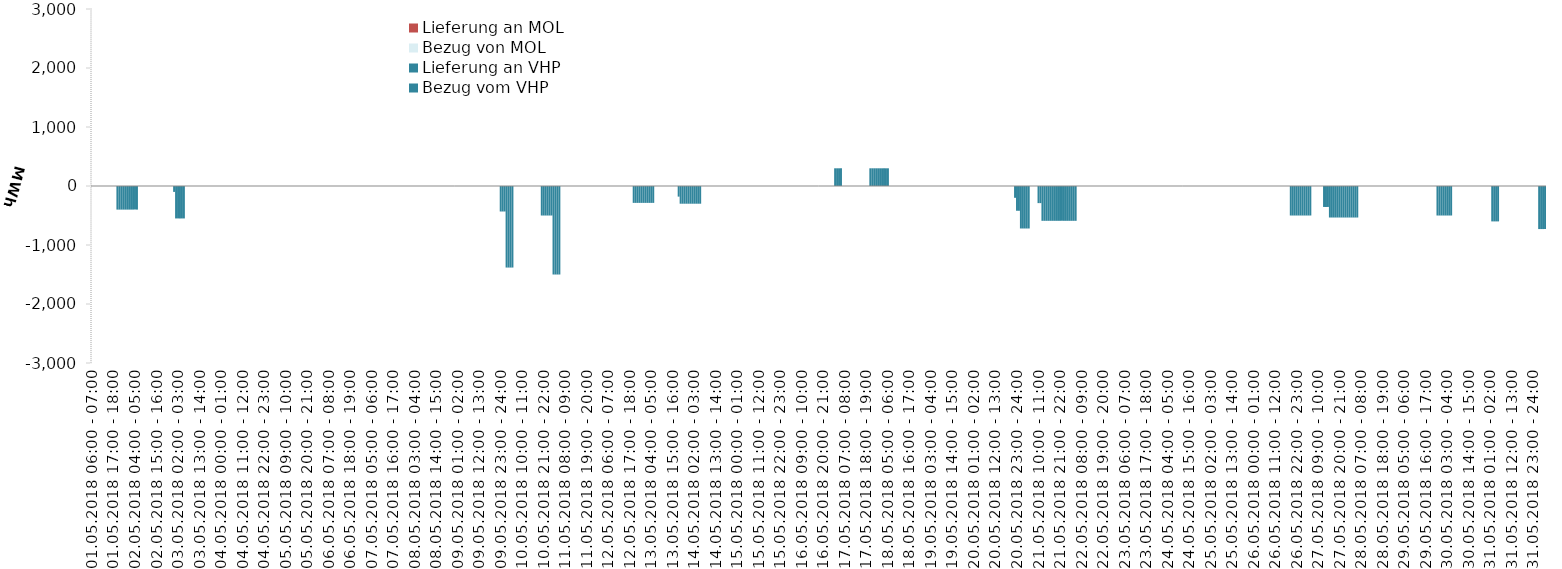
| Category | Bezug vom VHP | Lieferung an VHP | Bezug von MOL | Lieferung an MOL |
|---|---|---|---|---|
| 01.05.2018 06:00 - 07:00 | 0 | 0 | 0 | 0 |
| 01.05.2018 07:00 - 08:00 | 0 | 0 | 0 | 0 |
| 01.05.2018 08:00 - 09:00 | 0 | 0 | 0 | 0 |
| 01.05.2018 09:00 - 10:00 | 0 | 0 | 0 | 0 |
| 01.05.2018 10:00 - 11:00 | 0 | 0 | 0 | 0 |
| 01.05.2018 11:00 - 12:00 | 0 | 0 | 0 | 0 |
| 01.05.2018 12:00 - 13:00 | 0 | 0 | 0 | 0 |
| 01.05.2018 13:00 - 14:00 | 0 | 0 | 0 | 0 |
| 01.05.2018 14:00 - 15:00 | 0 | 0 | 0 | 0 |
| 01.05.2018 15:00 - 16:00 | 0 | 0 | 0 | 0 |
| 01.05.2018 16:00 - 17:00 | 0 | 0 | 0 | 0 |
| 01.05.2018 17:00 - 18:00 | 0 | 0 | 0 | 0 |
| 01.05.2018 18:00 - 19:00 | 0 | 0 | 0 | 0 |
| 01.05.2018 19:00 - 20:00 | 0 | -400 | 0 | 0 |
| 01.05.2018 20:00 - 21:00 | 0 | -400 | 0 | 0 |
| 01.05.2018 21:00 - 22:00 | 0 | -400 | 0 | 0 |
| 01.05.2018 22:00 - 23:00 | 0 | -400 | 0 | 0 |
| 01.05.2018 23:00 - 24:00 | 0 | -400 | 0 | 0 |
| 02.05.2018 00:00 - 01:00 | 0 | -400 | 0 | 0 |
| 02.05.2018 01:00 - 02:00 | 0 | -400 | 0 | 0 |
| 02.05.2018 02:00 - 03:00 | 0 | -400 | 0 | 0 |
| 02.05.2018 03:00 - 04:00 | 0 | -400 | 0 | 0 |
| 02.05.2018 04:00 - 05:00 | 0 | -400 | 0 | 0 |
| 02.05.2018 05:00 - 06:00 | 0 | -400 | 0 | 0 |
| 02.05.2018 06:00 - 07:00 | 0 | 0 | 0 | 0 |
| 02.05.2018 07:00 - 08:00 | 0 | 0 | 0 | 0 |
| 02.05.2018 08:00 - 09:00 | 0 | 0 | 0 | 0 |
| 02.05.2018 09:00 - 10:00 | 0 | 0 | 0 | 0 |
| 02.05.2018 10:00 - 11:00 | 0 | 0 | 0 | 0 |
| 02.05.2018 11:00 - 12:00 | 0 | 0 | 0 | 0 |
| 02.05.2018 12:00 - 13:00 | 0 | 0 | 0 | 0 |
| 02.05.2018 13:00 - 14:00 | 0 | 0 | 0 | 0 |
| 02.05.2018 14:00 - 15:00 | 0 | 0 | 0 | 0 |
| 02.05.2018 15:00 - 16:00 | 0 | 0 | 0 | 0 |
| 02.05.2018 16:00 - 17:00 | 0 | 0 | 0 | 0 |
| 02.05.2018 17:00 - 18:00 | 0 | 0 | 0 | 0 |
| 02.05.2018 18:00 - 19:00 | 0 | 0 | 0 | 0 |
| 02.05.2018 19:00 - 20:00 | 0 | 0 | 0 | 0 |
| 02.05.2018 20:00 - 21:00 | 0 | 0 | 0 | 0 |
| 02.05.2018 21:00 - 22:00 | 0 | 0 | 0 | 0 |
| 02.05.2018 22:00 - 23:00 | 0 | 0 | 0 | 0 |
| 02.05.2018 23:00 - 24:00 | 0 | 0 | 0 | 0 |
| 03.05.2018 00:00 - 01:00 | 0 | -100 | 0 | 0 |
| 03.05.2018 01:00 - 02:00 | 0 | -550 | 0 | 0 |
| 03.05.2018 02:00 - 03:00 | 0 | -550 | 0 | 0 |
| 03.05.2018 03:00 - 04:00 | 0 | -550 | 0 | 0 |
| 03.05.2018 04:00 - 05:00 | 0 | -550 | 0 | 0 |
| 03.05.2018 05:00 - 06:00 | 0 | -550 | 0 | 0 |
| 03.05.2018 06:00 - 07:00 | 0 | 0 | 0 | 0 |
| 03.05.2018 07:00 - 08:00 | 0 | 0 | 0 | 0 |
| 03.05.2018 08:00 - 09:00 | 0 | 0 | 0 | 0 |
| 03.05.2018 09:00 - 10:00 | 0 | 0 | 0 | 0 |
| 03.05.2018 10:00 - 11:00 | 0 | 0 | 0 | 0 |
| 03.05.2018 11:00 - 12:00 | 0 | 0 | 0 | 0 |
| 03.05.2018 12:00 - 13:00 | 0 | 0 | 0 | 0 |
| 03.05.2018 13:00 - 14:00 | 0 | 0 | 0 | 0 |
| 03.05.2018 14:00 - 15:00 | 0 | 0 | 0 | 0 |
| 03.05.2018 15:00 - 16:00 | 0 | 0 | 0 | 0 |
| 03.05.2018 16:00 - 17:00 | 0 | 0 | 0 | 0 |
| 03.05.2018 17:00 - 18:00 | 0 | 0 | 0 | 0 |
| 03.05.2018 18:00 - 19:00 | 0 | 0 | 0 | 0 |
| 03.05.2018 19:00 - 20:00 | 0 | 0 | 0 | 0 |
| 03.05.2018 20:00 - 21:00 | 0 | 0 | 0 | 0 |
| 03.05.2018 21:00 - 22:00 | 0 | 0 | 0 | 0 |
| 03.05.2018 22:00 - 23:00 | 0 | 0 | 0 | 0 |
| 03.05.2018 23:00 - 24:00 | 0 | 0 | 0 | 0 |
| 04.05.2018 00:00 - 01:00 | 0 | 0 | 0 | 0 |
| 04.05.2018 01:00 - 02:00 | 0 | 0 | 0 | 0 |
| 04.05.2018 02:00 - 03:00 | 0 | 0 | 0 | 0 |
| 04.05.2018 03:00 - 04:00 | 0 | 0 | 0 | 0 |
| 04.05.2018 04:00 - 05:00 | 0 | 0 | 0 | 0 |
| 04.05.2018 05:00 - 06:00 | 0 | 0 | 0 | 0 |
| 04.05.2018 06:00 - 07:00 | 0 | 0 | 0 | 0 |
| 04.05.2018 07:00 - 08:00 | 0 | 0 | 0 | 0 |
| 04.05.2018 08:00 - 09:00 | 0 | 0 | 0 | 0 |
| 04.05.2018 09:00 - 10:00 | 0 | 0 | 0 | 0 |
| 04.05.2018 10:00 - 11:00 | 0 | 0 | 0 | 0 |
| 04.05.2018 11:00 - 12:00 | 0 | 0 | 0 | 0 |
| 04.05.2018 12:00 - 13:00 | 0 | 0 | 0 | 0 |
| 04.05.2018 13:00 - 14:00 | 0 | 0 | 0 | 0 |
| 04.05.2018 14:00 - 15:00 | 0 | 0 | 0 | 0 |
| 04.05.2018 15:00 - 16:00 | 0 | 0 | 0 | 0 |
| 04.05.2018 16:00 - 17:00 | 0 | 0 | 0 | 0 |
| 04.05.2018 17:00 - 18:00 | 0 | 0 | 0 | 0 |
| 04.05.2018 18:00 - 19:00 | 0 | 0 | 0 | 0 |
| 04.05.2018 19:00 - 20:00 | 0 | 0 | 0 | 0 |
| 04.05.2018 20:00 - 21:00 | 0 | 0 | 0 | 0 |
| 04.05.2018 21:00 - 22:00 | 0 | 0 | 0 | 0 |
| 04.05.2018 22:00 - 23:00 | 0 | 0 | 0 | 0 |
| 04.05.2018 23:00 - 24:00 | 0 | 0 | 0 | 0 |
| 05.05.2018 00:00 - 01:00 | 0 | 0 | 0 | 0 |
| 05.05.2018 01:00 - 02:00 | 0 | 0 | 0 | 0 |
| 05.05.2018 02:00 - 03:00 | 0 | 0 | 0 | 0 |
| 05.05.2018 03:00 - 04:00 | 0 | 0 | 0 | 0 |
| 05.05.2018 04:00 - 05:00 | 0 | 0 | 0 | 0 |
| 05.05.2018 05:00 - 06:00 | 0 | 0 | 0 | 0 |
| 05.05.2018 06:00 - 07:00 | 0 | 0 | 0 | 0 |
| 05.05.2018 07:00 - 08:00 | 0 | 0 | 0 | 0 |
| 05.05.2018 08:00 - 09:00 | 0 | 0 | 0 | 0 |
| 05.05.2018 09:00 - 10:00 | 0 | 0 | 0 | 0 |
| 05.05.2018 10:00 - 11:00 | 0 | 0 | 0 | 0 |
| 05.05.2018 11:00 - 12:00 | 0 | 0 | 0 | 0 |
| 05.05.2018 12:00 - 13:00 | 0 | 0 | 0 | 0 |
| 05.05.2018 13:00 - 14:00 | 0 | 0 | 0 | 0 |
| 05.05.2018 14:00 - 15:00 | 0 | 0 | 0 | 0 |
| 05.05.2018 15:00 - 16:00 | 0 | 0 | 0 | 0 |
| 05.05.2018 16:00 - 17:00 | 0 | 0 | 0 | 0 |
| 05.05.2018 17:00 - 18:00 | 0 | 0 | 0 | 0 |
| 05.05.2018 18:00 - 19:00 | 0 | 0 | 0 | 0 |
| 05.05.2018 19:00 - 20:00 | 0 | 0 | 0 | 0 |
| 05.05.2018 20:00 - 21:00 | 0 | 0 | 0 | 0 |
| 05.05.2018 21:00 - 22:00 | 0 | 0 | 0 | 0 |
| 05.05.2018 22:00 - 23:00 | 0 | 0 | 0 | 0 |
| 05.05.2018 23:00 - 24:00 | 0 | 0 | 0 | 0 |
| 06.05.2018 00:00 - 01:00 | 0 | 0 | 0 | 0 |
| 06.05.2018 01:00 - 02:00 | 0 | 0 | 0 | 0 |
| 06.05.2018 02:00 - 03:00 | 0 | 0 | 0 | 0 |
| 06.05.2018 03:00 - 04:00 | 0 | 0 | 0 | 0 |
| 06.05.2018 04:00 - 05:00 | 0 | 0 | 0 | 0 |
| 06.05.2018 05:00 - 06:00 | 0 | 0 | 0 | 0 |
| 06.05.2018 06:00 - 07:00 | 0 | 0 | 0 | 0 |
| 06.05.2018 07:00 - 08:00 | 0 | 0 | 0 | 0 |
| 06.05.2018 08:00 - 09:00 | 0 | 0 | 0 | 0 |
| 06.05.2018 09:00 - 10:00 | 0 | 0 | 0 | 0 |
| 06.05.2018 10:00 - 11:00 | 0 | 0 | 0 | 0 |
| 06.05.2018 11:00 - 12:00 | 0 | 0 | 0 | 0 |
| 06.05.2018 12:00 - 13:00 | 0 | 0 | 0 | 0 |
| 06.05.2018 13:00 - 14:00 | 0 | 0 | 0 | 0 |
| 06.05.2018 14:00 - 15:00 | 0 | 0 | 0 | 0 |
| 06.05.2018 15:00 - 16:00 | 0 | 0 | 0 | 0 |
| 06.05.2018 16:00 - 17:00 | 0 | 0 | 0 | 0 |
| 06.05.2018 17:00 - 18:00 | 0 | 0 | 0 | 0 |
| 06.05.2018 18:00 - 19:00 | 0 | 0 | 0 | 0 |
| 06.05.2018 19:00 - 20:00 | 0 | 0 | 0 | 0 |
| 06.05.2018 20:00 - 21:00 | 0 | 0 | 0 | 0 |
| 06.05.2018 21:00 - 22:00 | 0 | 0 | 0 | 0 |
| 06.05.2018 22:00 - 23:00 | 0 | 0 | 0 | 0 |
| 06.05.2018 23:00 - 24:00 | 0 | 0 | 0 | 0 |
| 07.05.2018 00:00 - 01:00 | 0 | 0 | 0 | 0 |
| 07.05.2018 01:00 - 02:00 | 0 | 0 | 0 | 0 |
| 07.05.2018 02:00 - 03:00 | 0 | 0 | 0 | 0 |
| 07.05.2018 03:00 - 04:00 | 0 | 0 | 0 | 0 |
| 07.05.2018 04:00 - 05:00 | 0 | 0 | 0 | 0 |
| 07.05.2018 05:00 - 06:00 | 0 | 0 | 0 | 0 |
| 07.05.2018 06:00 - 07:00 | 0 | 0 | 0 | 0 |
| 07.05.2018 07:00 - 08:00 | 0 | 0 | 0 | 0 |
| 07.05.2018 08:00 - 09:00 | 0 | 0 | 0 | 0 |
| 07.05.2018 09:00 - 10:00 | 0 | 0 | 0 | 0 |
| 07.05.2018 10:00 - 11:00 | 0 | 0 | 0 | 0 |
| 07.05.2018 11:00 - 12:00 | 0 | 0 | 0 | 0 |
| 07.05.2018 12:00 - 13:00 | 0 | 0 | 0 | 0 |
| 07.05.2018 13:00 - 14:00 | 0 | 0 | 0 | 0 |
| 07.05.2018 14:00 - 15:00 | 0 | 0 | 0 | 0 |
| 07.05.2018 15:00 - 16:00 | 0 | 0 | 0 | 0 |
| 07.05.2018 16:00 - 17:00 | 0 | 0 | 0 | 0 |
| 07.05.2018 17:00 - 18:00 | 0 | 0 | 0 | 0 |
| 07.05.2018 18:00 - 19:00 | 0 | 0 | 0 | 0 |
| 07.05.2018 19:00 - 20:00 | 0 | 0 | 0 | 0 |
| 07.05.2018 20:00 - 21:00 | 0 | 0 | 0 | 0 |
| 07.05.2018 21:00 - 22:00 | 0 | 0 | 0 | 0 |
| 07.05.2018 22:00 - 23:00 | 0 | 0 | 0 | 0 |
| 07.05.2018 23:00 - 24:00 | 0 | 0 | 0 | 0 |
| 08.05.2018 00:00 - 01:00 | 0 | 0 | 0 | 0 |
| 08.05.2018 01:00 - 02:00 | 0 | 0 | 0 | 0 |
| 08.05.2018 02:00 - 03:00 | 0 | 0 | 0 | 0 |
| 08.05.2018 03:00 - 04:00 | 0 | 0 | 0 | 0 |
| 08.05.2018 04:00 - 05:00 | 0 | 0 | 0 | 0 |
| 08.05.2018 05:00 - 06:00 | 0 | 0 | 0 | 0 |
| 08.05.2018 06:00 - 07:00 | 0 | 0 | 0 | 0 |
| 08.05.2018 07:00 - 08:00 | 0 | 0 | 0 | 0 |
| 08.05.2018 08:00 - 09:00 | 0 | 0 | 0 | 0 |
| 08.05.2018 09:00 - 10:00 | 0 | 0 | 0 | 0 |
| 08.05.2018 10:00 - 11:00 | 0 | 0 | 0 | 0 |
| 08.05.2018 11:00 - 12:00 | 0 | 0 | 0 | 0 |
| 08.05.2018 12:00 - 13:00 | 0 | 0 | 0 | 0 |
| 08.05.2018 13:00 - 14:00 | 0 | 0 | 0 | 0 |
| 08.05.2018 14:00 - 15:00 | 0 | 0 | 0 | 0 |
| 08.05.2018 15:00 - 16:00 | 0 | 0 | 0 | 0 |
| 08.05.2018 16:00 - 17:00 | 0 | 0 | 0 | 0 |
| 08.05.2018 17:00 - 18:00 | 0 | 0 | 0 | 0 |
| 08.05.2018 18:00 - 19:00 | 0 | 0 | 0 | 0 |
| 08.05.2018 19:00 - 20:00 | 0 | 0 | 0 | 0 |
| 08.05.2018 20:00 - 21:00 | 0 | 0 | 0 | 0 |
| 08.05.2018 21:00 - 22:00 | 0 | 0 | 0 | 0 |
| 08.05.2018 22:00 - 23:00 | 0 | 0 | 0 | 0 |
| 08.05.2018 23:00 - 24:00 | 0 | 0 | 0 | 0 |
| 09.05.2018 00:00 - 01:00 | 0 | 0 | 0 | 0 |
| 09.05.2018 01:00 - 02:00 | 0 | 0 | 0 | 0 |
| 09.05.2018 02:00 - 03:00 | 0 | 0 | 0 | 0 |
| 09.05.2018 03:00 - 04:00 | 0 | 0 | 0 | 0 |
| 09.05.2018 04:00 - 05:00 | 0 | 0 | 0 | 0 |
| 09.05.2018 05:00 - 06:00 | 0 | 0 | 0 | 0 |
| 09.05.2018 06:00 - 07:00 | 0 | 0 | 0 | 0 |
| 09.05.2018 07:00 - 08:00 | 0 | 0 | 0 | 0 |
| 09.05.2018 08:00 - 09:00 | 0 | 0 | 0 | 0 |
| 09.05.2018 09:00 - 10:00 | 0 | 0 | 0 | 0 |
| 09.05.2018 10:00 - 11:00 | 0 | 0 | 0 | 0 |
| 09.05.2018 11:00 - 12:00 | 0 | 0 | 0 | 0 |
| 09.05.2018 12:00 - 13:00 | 0 | 0 | 0 | 0 |
| 09.05.2018 13:00 - 14:00 | 0 | 0 | 0 | 0 |
| 09.05.2018 14:00 - 15:00 | 0 | 0 | 0 | 0 |
| 09.05.2018 15:00 - 16:00 | 0 | 0 | 0 | 0 |
| 09.05.2018 16:00 - 17:00 | 0 | 0 | 0 | 0 |
| 09.05.2018 17:00 - 18:00 | 0 | 0 | 0 | 0 |
| 09.05.2018 18:00 - 19:00 | 0 | 0 | 0 | 0 |
| 09.05.2018 19:00 - 20:00 | 0 | 0 | 0 | 0 |
| 09.05.2018 20:00 - 21:00 | 0 | 0 | 0 | 0 |
| 09.05.2018 21:00 - 22:00 | 0 | 0 | 0 | 0 |
| 09.05.2018 22:00 - 23:00 | 0 | 0 | 0 | 0 |
| 09.05.2018 23:00 - 24:00 | 0 | -432 | 0 | 0 |
| 10.05.2018 00:00 - 01:00 | 0 | -432 | 0 | 0 |
| 10.05.2018 01:00 - 02:00 | 0 | -432 | 0 | 0 |
| 10.05.2018 02:00 - 03:00 | 0 | -1382 | 0 | 0 |
| 10.05.2018 03:00 - 04:00 | 0 | -1382 | 0 | 0 |
| 10.05.2018 04:00 - 05:00 | 0 | -1382 | 0 | 0 |
| 10.05.2018 05:00 - 06:00 | 0 | -1382 | 0 | 0 |
| 10.05.2018 06:00 - 07:00 | 0 | 0 | 0 | 0 |
| 10.05.2018 07:00 - 08:00 | 0 | 0 | 0 | 0 |
| 10.05.2018 08:00 - 09:00 | 0 | 0 | 0 | 0 |
| 10.05.2018 09:00 - 10:00 | 0 | 0 | 0 | 0 |
| 10.05.2018 10:00 - 11:00 | 0 | 0 | 0 | 0 |
| 10.05.2018 11:00 - 12:00 | 0 | 0 | 0 | 0 |
| 10.05.2018 12:00 - 13:00 | 0 | 0 | 0 | 0 |
| 10.05.2018 13:00 - 14:00 | 0 | 0 | 0 | 0 |
| 10.05.2018 14:00 - 15:00 | 0 | 0 | 0 | 0 |
| 10.05.2018 15:00 - 16:00 | 0 | 0 | 0 | 0 |
| 10.05.2018 16:00 - 17:00 | 0 | 0 | 0 | 0 |
| 10.05.2018 17:00 - 18:00 | 0 | 0 | 0 | 0 |
| 10.05.2018 18:00 - 19:00 | 0 | 0 | 0 | 0 |
| 10.05.2018 19:00 - 20:00 | 0 | 0 | 0 | 0 |
| 10.05.2018 20:00 - 21:00 | 0 | -500 | 0 | 0 |
| 10.05.2018 21:00 - 22:00 | 0 | -500 | 0 | 0 |
| 10.05.2018 22:00 - 23:00 | 0 | -500 | 0 | 0 |
| 10.05.2018 23:00 - 24:00 | 0 | -500 | 0 | 0 |
| 11.05.2018 00:00 - 01:00 | 0 | -500 | 0 | 0 |
| 11.05.2018 01:00 - 02:00 | 0 | -500 | 0 | 0 |
| 11.05.2018 02:00 - 03:00 | 0 | -1500 | 0 | 0 |
| 11.05.2018 03:00 - 04:00 | 0 | -1500 | 0 | 0 |
| 11.05.2018 04:00 - 05:00 | 0 | -1500 | 0 | 0 |
| 11.05.2018 05:00 - 06:00 | 0 | -1500 | 0 | 0 |
| 11.05.2018 06:00 - 07:00 | 0 | 0 | 0 | 0 |
| 11.05.2018 07:00 - 08:00 | 0 | 0 | 0 | 0 |
| 11.05.2018 08:00 - 09:00 | 0 | 0 | 0 | 0 |
| 11.05.2018 09:00 - 10:00 | 0 | 0 | 0 | 0 |
| 11.05.2018 10:00 - 11:00 | 0 | 0 | 0 | 0 |
| 11.05.2018 11:00 - 12:00 | 0 | 0 | 0 | 0 |
| 11.05.2018 12:00 - 13:00 | 0 | 0 | 0 | 0 |
| 11.05.2018 13:00 - 14:00 | 0 | 0 | 0 | 0 |
| 11.05.2018 14:00 - 15:00 | 0 | 0 | 0 | 0 |
| 11.05.2018 15:00 - 16:00 | 0 | 0 | 0 | 0 |
| 11.05.2018 16:00 - 17:00 | 0 | 0 | 0 | 0 |
| 11.05.2018 17:00 - 18:00 | 0 | 0 | 0 | 0 |
| 11.05.2018 18:00 - 19:00 | 0 | 0 | 0 | 0 |
| 11.05.2018 19:00 - 20:00 | 0 | 0 | 0 | 0 |
| 11.05.2018 20:00 - 21:00 | 0 | 0 | 0 | 0 |
| 11.05.2018 21:00 - 22:00 | 0 | 0 | 0 | 0 |
| 11.05.2018 22:00 - 23:00 | 0 | 0 | 0 | 0 |
| 11.05.2018 23:00 - 24:00 | 0 | 0 | 0 | 0 |
| 12.05.2018 00:00 - 01:00 | 0 | 0 | 0 | 0 |
| 12.05.2018 01:00 - 02:00 | 0 | 0 | 0 | 0 |
| 12.05.2018 02:00 - 03:00 | 0 | 0 | 0 | 0 |
| 12.05.2018 03:00 - 04:00 | 0 | 0 | 0 | 0 |
| 12.05.2018 04:00 - 05:00 | 0 | 0 | 0 | 0 |
| 12.05.2018 05:00 - 06:00 | 0 | 0 | 0 | 0 |
| 12.05.2018 06:00 - 07:00 | 0 | 0 | 0 | 0 |
| 12.05.2018 07:00 - 08:00 | 0 | 0 | 0 | 0 |
| 12.05.2018 08:00 - 09:00 | 0 | 0 | 0 | 0 |
| 12.05.2018 09:00 - 10:00 | 0 | 0 | 0 | 0 |
| 12.05.2018 10:00 - 11:00 | 0 | 0 | 0 | 0 |
| 12.05.2018 11:00 - 12:00 | 0 | 0 | 0 | 0 |
| 12.05.2018 12:00 - 13:00 | 0 | 0 | 0 | 0 |
| 12.05.2018 13:00 - 14:00 | 0 | 0 | 0 | 0 |
| 12.05.2018 14:00 - 15:00 | 0 | 0 | 0 | 0 |
| 12.05.2018 15:00 - 16:00 | 0 | 0 | 0 | 0 |
| 12.05.2018 16:00 - 17:00 | 0 | 0 | 0 | 0 |
| 12.05.2018 17:00 - 18:00 | 0 | 0 | 0 | 0 |
| 12.05.2018 18:00 - 19:00 | 0 | 0 | 0 | 0 |
| 12.05.2018 19:00 - 20:00 | 0 | -286 | 0 | 0 |
| 12.05.2018 20:00 - 21:00 | 0 | -286 | 0 | 0 |
| 12.05.2018 21:00 - 22:00 | 0 | -286 | 0 | 0 |
| 12.05.2018 22:00 - 23:00 | 0 | -286 | 0 | 0 |
| 12.05.2018 23:00 - 24:00 | 0 | -286 | 0 | 0 |
| 13.05.2018 00:00 - 01:00 | 0 | -286 | 0 | 0 |
| 13.05.2018 01:00 - 02:00 | 0 | -286 | 0 | 0 |
| 13.05.2018 02:00 - 03:00 | 0 | -286 | 0 | 0 |
| 13.05.2018 03:00 - 04:00 | 0 | -286 | 0 | 0 |
| 13.05.2018 04:00 - 05:00 | 0 | -286 | 0 | 0 |
| 13.05.2018 05:00 - 06:00 | 0 | -286 | 0 | 0 |
| 13.05.2018 06:00 - 07:00 | 0 | 0 | 0 | 0 |
| 13.05.2018 07:00 - 08:00 | 0 | 0 | 0 | 0 |
| 13.05.2018 08:00 - 09:00 | 0 | 0 | 0 | 0 |
| 13.05.2018 09:00 - 10:00 | 0 | 0 | 0 | 0 |
| 13.05.2018 10:00 - 11:00 | 0 | 0 | 0 | 0 |
| 13.05.2018 11:00 - 12:00 | 0 | 0 | 0 | 0 |
| 13.05.2018 12:00 - 13:00 | 0 | 0 | 0 | 0 |
| 13.05.2018 13:00 - 14:00 | 0 | 0 | 0 | 0 |
| 13.05.2018 14:00 - 15:00 | 0 | 0 | 0 | 0 |
| 13.05.2018 15:00 - 16:00 | 0 | 0 | 0 | 0 |
| 13.05.2018 16:00 - 17:00 | 0 | 0 | 0 | 0 |
| 13.05.2018 17:00 - 18:00 | 0 | 0 | 0 | 0 |
| 13.05.2018 18:00 - 19:00 | 0 | -180 | 0 | 0 |
| 13.05.2018 19:00 - 20:00 | 0 | -300 | 0 | 0 |
| 13.05.2018 20:00 - 21:00 | 0 | -300 | 0 | 0 |
| 13.05.2018 21:00 - 22:00 | 0 | -300 | 0 | 0 |
| 13.05.2018 22:00 - 23:00 | 0 | -300 | 0 | 0 |
| 13.05.2018 23:00 - 24:00 | 0 | -300 | 0 | 0 |
| 14.05.2018 00:00 - 01:00 | 0 | -300 | 0 | 0 |
| 14.05.2018 01:00 - 02:00 | 0 | -300 | 0 | 0 |
| 14.05.2018 02:00 - 03:00 | 0 | -300 | 0 | 0 |
| 14.05.2018 03:00 - 04:00 | 0 | -300 | 0 | 0 |
| 14.05.2018 04:00 - 05:00 | 0 | -300 | 0 | 0 |
| 14.05.2018 05:00 - 06:00 | 0 | -300 | 0 | 0 |
| 14.05.2018 06:00 - 07:00 | 0 | 0 | 0 | 0 |
| 14.05.2018 07:00 - 08:00 | 0 | 0 | 0 | 0 |
| 14.05.2018 08:00 - 09:00 | 0 | 0 | 0 | 0 |
| 14.05.2018 09:00 - 10:00 | 0 | 0 | 0 | 0 |
| 14.05.2018 10:00 - 11:00 | 0 | 0 | 0 | 0 |
| 14.05.2018 11:00 - 12:00 | 0 | 0 | 0 | 0 |
| 14.05.2018 12:00 - 13:00 | 0 | 0 | 0 | 0 |
| 14.05.2018 13:00 - 14:00 | 0 | 0 | 0 | 0 |
| 14.05.2018 14:00 - 15:00 | 0 | 0 | 0 | 0 |
| 14.05.2018 15:00 - 16:00 | 0 | 0 | 0 | 0 |
| 14.05.2018 16:00 - 17:00 | 0 | 0 | 0 | 0 |
| 14.05.2018 17:00 - 18:00 | 0 | 0 | 0 | 0 |
| 14.05.2018 18:00 - 19:00 | 0 | 0 | 0 | 0 |
| 14.05.2018 19:00 - 20:00 | 0 | 0 | 0 | 0 |
| 14.05.2018 20:00 - 21:00 | 0 | 0 | 0 | 0 |
| 14.05.2018 21:00 - 22:00 | 0 | 0 | 0 | 0 |
| 14.05.2018 22:00 - 23:00 | 0 | 0 | 0 | 0 |
| 14.05.2018 23:00 - 24:00 | 0 | 0 | 0 | 0 |
| 15.05.2018 00:00 - 01:00 | 0 | 0 | 0 | 0 |
| 15.05.2018 01:00 - 02:00 | 0 | 0 | 0 | 0 |
| 15.05.2018 02:00 - 03:00 | 0 | 0 | 0 | 0 |
| 15.05.2018 03:00 - 04:00 | 0 | 0 | 0 | 0 |
| 15.05.2018 04:00 - 05:00 | 0 | 0 | 0 | 0 |
| 15.05.2018 05:00 - 06:00 | 0 | 0 | 0 | 0 |
| 15.05.2018 06:00 - 07:00 | 0 | 0 | 0 | 0 |
| 15.05.2018 07:00 - 08:00 | 0 | 0 | 0 | 0 |
| 15.05.2018 08:00 - 09:00 | 0 | 0 | 0 | 0 |
| 15.05.2018 09:00 - 10:00 | 0 | 0 | 0 | 0 |
| 15.05.2018 10:00 - 11:00 | 0 | 0 | 0 | 0 |
| 15.05.2018 11:00 - 12:00 | 0 | 0 | 0 | 0 |
| 15.05.2018 12:00 - 13:00 | 0 | 0 | 0 | 0 |
| 15.05.2018 13:00 - 14:00 | 0 | 0 | 0 | 0 |
| 15.05.2018 14:00 - 15:00 | 0 | 0 | 0 | 0 |
| 15.05.2018 15:00 - 16:00 | 0 | 0 | 0 | 0 |
| 15.05.2018 16:00 - 17:00 | 0 | 0 | 0 | 0 |
| 15.05.2018 17:00 - 18:00 | 0 | 0 | 0 | 0 |
| 15.05.2018 18:00 - 19:00 | 0 | 0 | 0 | 0 |
| 15.05.2018 19:00 - 20:00 | 0 | 0 | 0 | 0 |
| 15.05.2018 20:00 - 21:00 | 0 | 0 | 0 | 0 |
| 15.05.2018 21:00 - 22:00 | 0 | 0 | 0 | 0 |
| 15.05.2018 22:00 - 23:00 | 0 | 0 | 0 | 0 |
| 15.05.2018 23:00 - 24:00 | 0 | 0 | 0 | 0 |
| 16.05.2018 00:00 - 01:00 | 0 | 0 | 0 | 0 |
| 16.05.2018 01:00 - 02:00 | 0 | 0 | 0 | 0 |
| 16.05.2018 02:00 - 03:00 | 0 | 0 | 0 | 0 |
| 16.05.2018 03:00 - 04:00 | 0 | 0 | 0 | 0 |
| 16.05.2018 04:00 - 05:00 | 0 | 0 | 0 | 0 |
| 16.05.2018 05:00 - 06:00 | 0 | 0 | 0 | 0 |
| 16.05.2018 06:00 - 07:00 | 0 | 0 | 0 | 0 |
| 16.05.2018 07:00 - 08:00 | 0 | 0 | 0 | 0 |
| 16.05.2018 08:00 - 09:00 | 0 | 0 | 0 | 0 |
| 16.05.2018 09:00 - 10:00 | 0 | 0 | 0 | 0 |
| 16.05.2018 10:00 - 11:00 | 0 | 0 | 0 | 0 |
| 16.05.2018 11:00 - 12:00 | 0 | 0 | 0 | 0 |
| 16.05.2018 12:00 - 13:00 | 0 | 0 | 0 | 0 |
| 16.05.2018 13:00 - 14:00 | 0 | 0 | 0 | 0 |
| 16.05.2018 14:00 - 15:00 | 0 | 0 | 0 | 0 |
| 16.05.2018 15:00 - 16:00 | 0 | 0 | 0 | 0 |
| 16.05.2018 16:00 - 17:00 | 0 | 0 | 0 | 0 |
| 16.05.2018 17:00 - 18:00 | 0 | 0 | 0 | 0 |
| 16.05.2018 18:00 - 19:00 | 0 | 0 | 0 | 0 |
| 16.05.2018 19:00 - 20:00 | 0 | 0 | 0 | 0 |
| 16.05.2018 20:00 - 21:00 | 0 | 0 | 0 | 0 |
| 16.05.2018 21:00 - 22:00 | 0 | 0 | 0 | 0 |
| 16.05.2018 22:00 - 23:00 | 0 | 0 | 0 | 0 |
| 16.05.2018 23:00 - 24:00 | 0 | 0 | 0 | 0 |
| 17.05.2018 00:00 - 01:00 | 0 | 0 | 0 | 0 |
| 17.05.2018 01:00 - 02:00 | 0 | 0 | 0 | 0 |
| 17.05.2018 02:00 - 03:00 | 300 | 0 | 0 | 0 |
| 17.05.2018 03:00 - 04:00 | 300 | 0 | 0 | 0 |
| 17.05.2018 04:00 - 05:00 | 300 | 0 | 0 | 0 |
| 17.05.2018 05:00 - 06:00 | 300 | 0 | 0 | 0 |
| 17.05.2018 06:00 - 07:00 | 0 | 0 | 0 | 0 |
| 17.05.2018 07:00 - 08:00 | 0 | 0 | 0 | 0 |
| 17.05.2018 08:00 - 09:00 | 0 | 0 | 0 | 0 |
| 17.05.2018 09:00 - 10:00 | 0 | 0 | 0 | 0 |
| 17.05.2018 10:00 - 11:00 | 0 | 0 | 0 | 0 |
| 17.05.2018 11:00 - 12:00 | 0 | 0 | 0 | 0 |
| 17.05.2018 12:00 - 13:00 | 0 | 0 | 0 | 0 |
| 17.05.2018 13:00 - 14:00 | 0 | 0 | 0 | 0 |
| 17.05.2018 14:00 - 15:00 | 0 | 0 | 0 | 0 |
| 17.05.2018 15:00 - 16:00 | 0 | 0 | 0 | 0 |
| 17.05.2018 16:00 - 17:00 | 0 | 0 | 0 | 0 |
| 17.05.2018 17:00 - 18:00 | 0 | 0 | 0 | 0 |
| 17.05.2018 18:00 - 19:00 | 0 | 0 | 0 | 0 |
| 17.05.2018 19:00 - 20:00 | 0 | 0 | 0 | 0 |
| 17.05.2018 20:00 - 21:00 | 300 | 0 | 0 | 0 |
| 17.05.2018 21:00 - 22:00 | 300 | 0 | 0 | 0 |
| 17.05.2018 22:00 - 23:00 | 300 | 0 | 0 | 0 |
| 17.05.2018 23:00 - 24:00 | 300 | 0 | 0 | 0 |
| 18.05.2018 00:00 - 01:00 | 300 | 0 | 0 | 0 |
| 18.05.2018 01:00 - 02:00 | 300 | 0 | 0 | 0 |
| 18.05.2018 02:00 - 03:00 | 300 | 0 | 0 | 0 |
| 18.05.2018 03:00 - 04:00 | 300 | 0 | 0 | 0 |
| 18.05.2018 04:00 - 05:00 | 300 | 0 | 0 | 0 |
| 18.05.2018 05:00 - 06:00 | 300 | 0 | 0 | 0 |
| 18.05.2018 06:00 - 07:00 | 0 | 0 | 0 | 0 |
| 18.05.2018 07:00 - 08:00 | 0 | 0 | 0 | 0 |
| 18.05.2018 08:00 - 09:00 | 0 | 0 | 0 | 0 |
| 18.05.2018 09:00 - 10:00 | 0 | 0 | 0 | 0 |
| 18.05.2018 10:00 - 11:00 | 0 | 0 | 0 | 0 |
| 18.05.2018 11:00 - 12:00 | 0 | 0 | 0 | 0 |
| 18.05.2018 12:00 - 13:00 | 0 | 0 | 0 | 0 |
| 18.05.2018 13:00 - 14:00 | 0 | 0 | 0 | 0 |
| 18.05.2018 14:00 - 15:00 | 0 | 0 | 0 | 0 |
| 18.05.2018 15:00 - 16:00 | 0 | 0 | 0 | 0 |
| 18.05.2018 16:00 - 17:00 | 0 | 0 | 0 | 0 |
| 18.05.2018 17:00 - 18:00 | 0 | 0 | 0 | 0 |
| 18.05.2018 18:00 - 19:00 | 0 | 0 | 0 | 0 |
| 18.05.2018 19:00 - 20:00 | 0 | 0 | 0 | 0 |
| 18.05.2018 20:00 - 21:00 | 0 | 0 | 0 | 0 |
| 18.05.2018 21:00 - 22:00 | 0 | 0 | 0 | 0 |
| 18.05.2018 22:00 - 23:00 | 0 | 0 | 0 | 0 |
| 18.05.2018 23:00 - 24:00 | 0 | 0 | 0 | 0 |
| 19.05.2018 00:00 - 01:00 | 0 | 0 | 0 | 0 |
| 19.05.2018 01:00 - 02:00 | 0 | 0 | 0 | 0 |
| 19.05.2018 02:00 - 03:00 | 0 | 0 | 0 | 0 |
| 19.05.2018 03:00 - 04:00 | 0 | 0 | 0 | 0 |
| 19.05.2018 04:00 - 05:00 | 0 | 0 | 0 | 0 |
| 19.05.2018 05:00 - 06:00 | 0 | 0 | 0 | 0 |
| 19.05.2018 06:00 - 07:00 | 0 | 0 | 0 | 0 |
| 19.05.2018 07:00 - 08:00 | 0 | 0 | 0 | 0 |
| 19.05.2018 08:00 - 09:00 | 0 | 0 | 0 | 0 |
| 19.05.2018 09:00 - 10:00 | 0 | 0 | 0 | 0 |
| 19.05.2018 10:00 - 11:00 | 0 | 0 | 0 | 0 |
| 19.05.2018 11:00 - 12:00 | 0 | 0 | 0 | 0 |
| 19.05.2018 12:00 - 13:00 | 0 | 0 | 0 | 0 |
| 19.05.2018 13:00 - 14:00 | 0 | 0 | 0 | 0 |
| 19.05.2018 14:00 - 15:00 | 0 | 0 | 0 | 0 |
| 19.05.2018 15:00 - 16:00 | 0 | 0 | 0 | 0 |
| 19.05.2018 16:00 - 17:00 | 0 | 0 | 0 | 0 |
| 19.05.2018 17:00 - 18:00 | 0 | 0 | 0 | 0 |
| 19.05.2018 18:00 - 19:00 | 0 | 0 | 0 | 0 |
| 19.05.2018 19:00 - 20:00 | 0 | 0 | 0 | 0 |
| 19.05.2018 20:00 - 21:00 | 0 | 0 | 0 | 0 |
| 19.05.2018 21:00 - 22:00 | 0 | 0 | 0 | 0 |
| 19.05.2018 22:00 - 23:00 | 0 | 0 | 0 | 0 |
| 19.05.2018 23:00 - 24:00 | 0 | 0 | 0 | 0 |
| 20.05.2018 00:00 - 01:00 | 0 | 0 | 0 | 0 |
| 20.05.2018 01:00 - 02:00 | 0 | 0 | 0 | 0 |
| 20.05.2018 02:00 - 03:00 | 0 | 0 | 0 | 0 |
| 20.05.2018 03:00 - 04:00 | 0 | 0 | 0 | 0 |
| 20.05.2018 04:00 - 05:00 | 0 | 0 | 0 | 0 |
| 20.05.2018 05:00 - 06:00 | 0 | 0 | 0 | 0 |
| 20.05.2018 06:00 - 07:00 | 0 | 0 | 0 | 0 |
| 20.05.2018 07:00 - 08:00 | 0 | 0 | 0 | 0 |
| 20.05.2018 08:00 - 09:00 | 0 | 0 | 0 | 0 |
| 20.05.2018 09:00 - 10:00 | 0 | 0 | 0 | 0 |
| 20.05.2018 10:00 - 11:00 | 0 | 0 | 0 | 0 |
| 20.05.2018 11:00 - 12:00 | 0 | 0 | 0 | 0 |
| 20.05.2018 12:00 - 13:00 | 0 | 0 | 0 | 0 |
| 20.05.2018 13:00 - 14:00 | 0 | 0 | 0 | 0 |
| 20.05.2018 14:00 - 15:00 | 0 | 0 | 0 | 0 |
| 20.05.2018 15:00 - 16:00 | 0 | 0 | 0 | 0 |
| 20.05.2018 16:00 - 17:00 | 0 | 0 | 0 | 0 |
| 20.05.2018 17:00 - 18:00 | 0 | 0 | 0 | 0 |
| 20.05.2018 18:00 - 19:00 | 0 | 0 | 0 | 0 |
| 20.05.2018 19:00 - 20:00 | 0 | 0 | 0 | 0 |
| 20.05.2018 20:00 - 21:00 | 0 | 0 | 0 | 0 |
| 20.05.2018 21:00 - 22:00 | 0 | 0 | 0 | 0 |
| 20.05.2018 22:00 - 23:00 | 0 | -200 | 0 | 0 |
| 20.05.2018 23:00 - 24:00 | 0 | -420 | 0 | 0 |
| 21.05.2018 00:00 - 01:00 | 0 | -420 | 0 | 0 |
| 21.05.2018 01:00 - 02:00 | 0 | -720 | 0 | 0 |
| 21.05.2018 02:00 - 03:00 | 0 | -720 | 0 | 0 |
| 21.05.2018 03:00 - 04:00 | 0 | -720 | 0 | 0 |
| 21.05.2018 04:00 - 05:00 | 0 | -720 | 0 | 0 |
| 21.05.2018 05:00 - 06:00 | 0 | -720 | 0 | 0 |
| 21.05.2018 06:00 - 07:00 | 0 | 0 | 0 | 0 |
| 21.05.2018 07:00 - 08:00 | 0 | 0 | 0 | 0 |
| 21.05.2018 08:00 - 09:00 | 0 | 0 | 0 | 0 |
| 21.05.2018 09:00 - 10:00 | 0 | 0 | 0 | 0 |
| 21.05.2018 10:00 - 11:00 | 0 | -290 | 0 | 0 |
| 21.05.2018 11:00 - 12:00 | 0 | -290 | 0 | 0 |
| 21.05.2018 12:00 - 13:00 | 0 | -590 | 0 | 0 |
| 21.05.2018 13:00 - 14:00 | 0 | -590 | 0 | 0 |
| 21.05.2018 14:00 - 15:00 | 0 | -590 | 0 | 0 |
| 21.05.2018 15:00 - 16:00 | 0 | -590 | 0 | 0 |
| 21.05.2018 16:00 - 17:00 | 0 | -590 | 0 | 0 |
| 21.05.2018 17:00 - 18:00 | 0 | -590 | 0 | 0 |
| 21.05.2018 18:00 - 19:00 | 0 | -590 | 0 | 0 |
| 21.05.2018 19:00 - 20:00 | 0 | -590 | 0 | 0 |
| 21.05.2018 20:00 - 21:00 | 0 | -590 | 0 | 0 |
| 21.05.2018 21:00 - 22:00 | 0 | -590 | 0 | 0 |
| 21.05.2018 22:00 - 23:00 | 0 | -590 | 0 | 0 |
| 21.05.2018 23:00 - 24:00 | 0 | -590 | 0 | 0 |
| 22.05.2018 00:00 - 01:00 | 0 | -590 | 0 | 0 |
| 22.05.2018 01:00 - 02:00 | 0 | -590 | 0 | 0 |
| 22.05.2018 02:00 - 03:00 | 0 | -590 | 0 | 0 |
| 22.05.2018 03:00 - 04:00 | 0 | -590 | 0 | 0 |
| 22.05.2018 04:00 - 05:00 | 0 | -590 | 0 | 0 |
| 22.05.2018 05:00 - 06:00 | 0 | -590 | 0 | 0 |
| 22.05.2018 06:00 - 07:00 | 0 | 0 | 0 | 0 |
| 22.05.2018 07:00 - 08:00 | 0 | 0 | 0 | 0 |
| 22.05.2018 08:00 - 09:00 | 0 | 0 | 0 | 0 |
| 22.05.2018 09:00 - 10:00 | 0 | 0 | 0 | 0 |
| 22.05.2018 10:00 - 11:00 | 0 | 0 | 0 | 0 |
| 22.05.2018 11:00 - 12:00 | 0 | 0 | 0 | 0 |
| 22.05.2018 12:00 - 13:00 | 0 | 0 | 0 | 0 |
| 22.05.2018 13:00 - 14:00 | 0 | 0 | 0 | 0 |
| 22.05.2018 14:00 - 15:00 | 0 | 0 | 0 | 0 |
| 22.05.2018 15:00 - 16:00 | 0 | 0 | 0 | 0 |
| 22.05.2018 16:00 - 17:00 | 0 | 0 | 0 | 0 |
| 22.05.2018 17:00 - 18:00 | 0 | 0 | 0 | 0 |
| 22.05.2018 18:00 - 19:00 | 0 | 0 | 0 | 0 |
| 22.05.2018 19:00 - 20:00 | 0 | 0 | 0 | 0 |
| 22.05.2018 20:00 - 21:00 | 0 | 0 | 0 | 0 |
| 22.05.2018 21:00 - 22:00 | 0 | 0 | 0 | 0 |
| 22.05.2018 22:00 - 23:00 | 0 | 0 | 0 | 0 |
| 22.05.2018 23:00 - 24:00 | 0 | 0 | 0 | 0 |
| 23.05.2018 00:00 - 01:00 | 0 | 0 | 0 | 0 |
| 23.05.2018 01:00 - 02:00 | 0 | 0 | 0 | 0 |
| 23.05.2018 02:00 - 03:00 | 0 | 0 | 0 | 0 |
| 23.05.2018 03:00 - 04:00 | 0 | 0 | 0 | 0 |
| 23.05.2018 04:00 - 05:00 | 0 | 0 | 0 | 0 |
| 23.05.2018 05:00 - 06:00 | 0 | 0 | 0 | 0 |
| 23.05.2018 06:00 - 07:00 | 0 | 0 | 0 | 0 |
| 23.05.2018 07:00 - 08:00 | 0 | 0 | 0 | 0 |
| 23.05.2018 08:00 - 09:00 | 0 | 0 | 0 | 0 |
| 23.05.2018 09:00 - 10:00 | 0 | 0 | 0 | 0 |
| 23.05.2018 10:00 - 11:00 | 0 | 0 | 0 | 0 |
| 23.05.2018 11:00 - 12:00 | 0 | 0 | 0 | 0 |
| 23.05.2018 12:00 - 13:00 | 0 | 0 | 0 | 0 |
| 23.05.2018 13:00 - 14:00 | 0 | 0 | 0 | 0 |
| 23.05.2018 14:00 - 15:00 | 0 | 0 | 0 | 0 |
| 23.05.2018 15:00 - 16:00 | 0 | 0 | 0 | 0 |
| 23.05.2018 16:00 - 17:00 | 0 | 0 | 0 | 0 |
| 23.05.2018 17:00 - 18:00 | 0 | 0 | 0 | 0 |
| 23.05.2018 18:00 - 19:00 | 0 | 0 | 0 | 0 |
| 23.05.2018 19:00 - 20:00 | 0 | 0 | 0 | 0 |
| 23.05.2018 20:00 - 21:00 | 0 | 0 | 0 | 0 |
| 23.05.2018 21:00 - 22:00 | 0 | 0 | 0 | 0 |
| 23.05.2018 22:00 - 23:00 | 0 | 0 | 0 | 0 |
| 23.05.2018 23:00 - 24:00 | 0 | 0 | 0 | 0 |
| 24.05.2018 00:00 - 01:00 | 0 | 0 | 0 | 0 |
| 24.05.2018 01:00 - 02:00 | 0 | 0 | 0 | 0 |
| 24.05.2018 02:00 - 03:00 | 0 | 0 | 0 | 0 |
| 24.05.2018 03:00 - 04:00 | 0 | 0 | 0 | 0 |
| 24.05.2018 04:00 - 05:00 | 0 | 0 | 0 | 0 |
| 24.05.2018 05:00 - 06:00 | 0 | 0 | 0 | 0 |
| 24.05.2018 06:00 - 07:00 | 0 | 0 | 0 | 0 |
| 24.05.2018 07:00 - 08:00 | 0 | 0 | 0 | 0 |
| 24.05.2018 08:00 - 09:00 | 0 | 0 | 0 | 0 |
| 24.05.2018 09:00 - 10:00 | 0 | 0 | 0 | 0 |
| 24.05.2018 10:00 - 11:00 | 0 | 0 | 0 | 0 |
| 24.05.2018 11:00 - 12:00 | 0 | 0 | 0 | 0 |
| 24.05.2018 12:00 - 13:00 | 0 | 0 | 0 | 0 |
| 24.05.2018 13:00 - 14:00 | 0 | 0 | 0 | 0 |
| 24.05.2018 14:00 - 15:00 | 0 | 0 | 0 | 0 |
| 24.05.2018 15:00 - 16:00 | 0 | 0 | 0 | 0 |
| 24.05.2018 16:00 - 17:00 | 0 | 0 | 0 | 0 |
| 24.05.2018 17:00 - 18:00 | 0 | 0 | 0 | 0 |
| 24.05.2018 18:00 - 19:00 | 0 | 0 | 0 | 0 |
| 24.05.2018 19:00 - 20:00 | 0 | 0 | 0 | 0 |
| 24.05.2018 20:00 - 21:00 | 0 | 0 | 0 | 0 |
| 24.05.2018 21:00 - 22:00 | 0 | 0 | 0 | 0 |
| 24.05.2018 22:00 - 23:00 | 0 | 0 | 0 | 0 |
| 24.05.2018 23:00 - 24:00 | 0 | 0 | 0 | 0 |
| 25.05.2018 00:00 - 01:00 | 0 | 0 | 0 | 0 |
| 25.05.2018 01:00 - 02:00 | 0 | 0 | 0 | 0 |
| 25.05.2018 02:00 - 03:00 | 0 | 0 | 0 | 0 |
| 25.05.2018 03:00 - 04:00 | 0 | 0 | 0 | 0 |
| 25.05.2018 04:00 - 05:00 | 0 | 0 | 0 | 0 |
| 25.05.2018 05:00 - 06:00 | 0 | 0 | 0 | 0 |
| 25.05.2018 06:00 - 07:00 | 0 | 0 | 0 | 0 |
| 25.05.2018 07:00 - 08:00 | 0 | 0 | 0 | 0 |
| 25.05.2018 08:00 - 09:00 | 0 | 0 | 0 | 0 |
| 25.05.2018 09:00 - 10:00 | 0 | 0 | 0 | 0 |
| 25.05.2018 10:00 - 11:00 | 0 | 0 | 0 | 0 |
| 25.05.2018 11:00 - 12:00 | 0 | 0 | 0 | 0 |
| 25.05.2018 12:00 - 13:00 | 0 | 0 | 0 | 0 |
| 25.05.2018 13:00 - 14:00 | 0 | 0 | 0 | 0 |
| 25.05.2018 14:00 - 15:00 | 0 | 0 | 0 | 0 |
| 25.05.2018 15:00 - 16:00 | 0 | 0 | 0 | 0 |
| 25.05.2018 16:00 - 17:00 | 0 | 0 | 0 | 0 |
| 25.05.2018 17:00 - 18:00 | 0 | 0 | 0 | 0 |
| 25.05.2018 18:00 - 19:00 | 0 | 0 | 0 | 0 |
| 25.05.2018 19:00 - 20:00 | 0 | 0 | 0 | 0 |
| 25.05.2018 20:00 - 21:00 | 0 | 0 | 0 | 0 |
| 25.05.2018 21:00 - 22:00 | 0 | 0 | 0 | 0 |
| 25.05.2018 22:00 - 23:00 | 0 | 0 | 0 | 0 |
| 25.05.2018 23:00 - 24:00 | 0 | 0 | 0 | 0 |
| 26.05.2018 00:00 - 01:00 | 0 | 0 | 0 | 0 |
| 26.05.2018 01:00 - 02:00 | 0 | 0 | 0 | 0 |
| 26.05.2018 02:00 - 03:00 | 0 | 0 | 0 | 0 |
| 26.05.2018 03:00 - 04:00 | 0 | 0 | 0 | 0 |
| 26.05.2018 04:00 - 05:00 | 0 | 0 | 0 | 0 |
| 26.05.2018 05:00 - 06:00 | 0 | 0 | 0 | 0 |
| 26.05.2018 06:00 - 07:00 | 0 | 0 | 0 | 0 |
| 26.05.2018 07:00 - 08:00 | 0 | 0 | 0 | 0 |
| 26.05.2018 08:00 - 09:00 | 0 | 0 | 0 | 0 |
| 26.05.2018 09:00 - 10:00 | 0 | 0 | 0 | 0 |
| 26.05.2018 10:00 - 11:00 | 0 | 0 | 0 | 0 |
| 26.05.2018 11:00 - 12:00 | 0 | 0 | 0 | 0 |
| 26.05.2018 12:00 - 13:00 | 0 | 0 | 0 | 0 |
| 26.05.2018 13:00 - 14:00 | 0 | 0 | 0 | 0 |
| 26.05.2018 14:00 - 15:00 | 0 | 0 | 0 | 0 |
| 26.05.2018 15:00 - 16:00 | 0 | 0 | 0 | 0 |
| 26.05.2018 16:00 - 17:00 | 0 | 0 | 0 | 0 |
| 26.05.2018 17:00 - 18:00 | 0 | 0 | 0 | 0 |
| 26.05.2018 18:00 - 19:00 | 0 | 0 | 0 | 0 |
| 26.05.2018 19:00 - 20:00 | 0 | -500 | 0 | 0 |
| 26.05.2018 20:00 - 21:00 | 0 | -500 | 0 | 0 |
| 26.05.2018 21:00 - 22:00 | 0 | -500 | 0 | 0 |
| 26.05.2018 22:00 - 23:00 | 0 | -500 | 0 | 0 |
| 26.05.2018 23:00 - 24:00 | 0 | -500 | 0 | 0 |
| 27.05.2018 00:00 - 01:00 | 0 | -500 | 0 | 0 |
| 27.05.2018 01:00 - 02:00 | 0 | -500 | 0 | 0 |
| 27.05.2018 02:00 - 03:00 | 0 | -500 | 0 | 0 |
| 27.05.2018 03:00 - 04:00 | 0 | -500 | 0 | 0 |
| 27.05.2018 04:00 - 05:00 | 0 | -500 | 0 | 0 |
| 27.05.2018 05:00 - 06:00 | 0 | -500 | 0 | 0 |
| 27.05.2018 06:00 - 07:00 | 0 | 0 | 0 | 0 |
| 27.05.2018 07:00 - 08:00 | 0 | 0 | 0 | 0 |
| 27.05.2018 08:00 - 09:00 | 0 | 0 | 0 | 0 |
| 27.05.2018 09:00 - 10:00 | 0 | 0 | 0 | 0 |
| 27.05.2018 10:00 - 11:00 | 0 | 0 | 0 | 0 |
| 27.05.2018 11:00 - 12:00 | 0 | 0 | 0 | 0 |
| 27.05.2018 12:00 - 13:00 | 0 | -355 | 0 | 0 |
| 27.05.2018 13:00 - 14:00 | 0 | -355 | 0 | 0 |
| 27.05.2018 14:00 - 15:00 | 0 | -355 | 0 | 0 |
| 27.05.2018 15:00 - 16:00 | 0 | -534 | 0 | 0 |
| 27.05.2018 16:00 - 17:00 | 0 | -534 | 0 | 0 |
| 27.05.2018 17:00 - 18:00 | 0 | -534 | 0 | 0 |
| 27.05.2018 18:00 - 19:00 | 0 | -534 | 0 | 0 |
| 27.05.2018 19:00 - 20:00 | 0 | -534 | 0 | 0 |
| 27.05.2018 20:00 - 21:00 | 0 | -534 | 0 | 0 |
| 27.05.2018 21:00 - 22:00 | 0 | -534 | 0 | 0 |
| 27.05.2018 22:00 - 23:00 | 0 | -534 | 0 | 0 |
| 27.05.2018 23:00 - 24:00 | 0 | -534 | 0 | 0 |
| 28.05.2018 00:00 - 01:00 | 0 | -534 | 0 | 0 |
| 28.05.2018 01:00 - 02:00 | 0 | -534 | 0 | 0 |
| 28.05.2018 02:00 - 03:00 | 0 | -534 | 0 | 0 |
| 28.05.2018 03:00 - 04:00 | 0 | -534 | 0 | 0 |
| 28.05.2018 04:00 - 05:00 | 0 | -534 | 0 | 0 |
| 28.05.2018 05:00 - 06:00 | 0 | -534 | 0 | 0 |
| 28.05.2018 06:00 - 07:00 | 0 | 0 | 0 | 0 |
| 28.05.2018 07:00 - 08:00 | 0 | 0 | 0 | 0 |
| 28.05.2018 08:00 - 09:00 | 0 | 0 | 0 | 0 |
| 28.05.2018 09:00 - 10:00 | 0 | 0 | 0 | 0 |
| 28.05.2018 10:00 - 11:00 | 0 | 0 | 0 | 0 |
| 28.05.2018 11:00 - 12:00 | 0 | 0 | 0 | 0 |
| 28.05.2018 12:00 - 13:00 | 0 | 0 | 0 | 0 |
| 28.05.2018 13:00 - 14:00 | 0 | 0 | 0 | 0 |
| 28.05.2018 14:00 - 15:00 | 0 | 0 | 0 | 0 |
| 28.05.2018 15:00 - 16:00 | 0 | 0 | 0 | 0 |
| 28.05.2018 16:00 - 17:00 | 0 | 0 | 0 | 0 |
| 28.05.2018 17:00 - 18:00 | 0 | 0 | 0 | 0 |
| 28.05.2018 18:00 - 19:00 | 0 | 0 | 0 | 0 |
| 28.05.2018 19:00 - 20:00 | 0 | 0 | 0 | 0 |
| 28.05.2018 20:00 - 21:00 | 0 | 0 | 0 | 0 |
| 28.05.2018 21:00 - 22:00 | 0 | 0 | 0 | 0 |
| 28.05.2018 22:00 - 23:00 | 0 | 0 | 0 | 0 |
| 28.05.2018 23:00 - 24:00 | 0 | 0 | 0 | 0 |
| 29.05.2018 00:00 - 01:00 | 0 | 0 | 0 | 0 |
| 29.05.2018 01:00 - 02:00 | 0 | 0 | 0 | 0 |
| 29.05.2018 02:00 - 03:00 | 0 | 0 | 0 | 0 |
| 29.05.2018 03:00 - 04:00 | 0 | 0 | 0 | 0 |
| 29.05.2018 04:00 - 05:00 | 0 | 0 | 0 | 0 |
| 29.05.2018 05:00 - 06:00 | 0 | 0 | 0 | 0 |
| 29.05.2018 06:00 - 07:00 | 0 | 0 | 0 | 0 |
| 29.05.2018 07:00 - 08:00 | 0 | 0 | 0 | 0 |
| 29.05.2018 08:00 - 09:00 | 0 | 0 | 0 | 0 |
| 29.05.2018 09:00 - 10:00 | 0 | 0 | 0 | 0 |
| 29.05.2018 10:00 - 11:00 | 0 | 0 | 0 | 0 |
| 29.05.2018 11:00 - 12:00 | 0 | 0 | 0 | 0 |
| 29.05.2018 12:00 - 13:00 | 0 | 0 | 0 | 0 |
| 29.05.2018 13:00 - 14:00 | 0 | 0 | 0 | 0 |
| 29.05.2018 14:00 - 15:00 | 0 | 0 | 0 | 0 |
| 29.05.2018 15:00 - 16:00 | 0 | 0 | 0 | 0 |
| 29.05.2018 16:00 - 17:00 | 0 | 0 | 0 | 0 |
| 29.05.2018 17:00 - 18:00 | 0 | 0 | 0 | 0 |
| 29.05.2018 18:00 - 19:00 | 0 | 0 | 0 | 0 |
| 29.05.2018 19:00 - 20:00 | 0 | 0 | 0 | 0 |
| 29.05.2018 20:00 - 21:00 | 0 | 0 | 0 | 0 |
| 29.05.2018 21:00 - 22:00 | 0 | 0 | 0 | 0 |
| 29.05.2018 22:00 - 23:00 | 0 | -500 | 0 | 0 |
| 29.05.2018 23:00 - 24:00 | 0 | -500 | 0 | 0 |
| 30.05.2018 00:00 - 01:00 | 0 | -500 | 0 | 0 |
| 30.05.2018 01:00 - 02:00 | 0 | -500 | 0 | 0 |
| 30.05.2018 02:00 - 03:00 | 0 | -500 | 0 | 0 |
| 30.05.2018 03:00 - 04:00 | 0 | -500 | 0 | 0 |
| 30.05.2018 04:00 - 05:00 | 0 | -500 | 0 | 0 |
| 30.05.2018 05:00 - 06:00 | 0 | -500 | 0 | 0 |
| 30.05.2018 06:00 - 07:00 | 0 | 0 | 0 | 0 |
| 30.05.2018 07:00 - 08:00 | 0 | 0 | 0 | 0 |
| 30.05.2018 08:00 - 09:00 | 0 | 0 | 0 | 0 |
| 30.05.2018 09:00 - 10:00 | 0 | 0 | 0 | 0 |
| 30.05.2018 10:00 - 11:00 | 0 | 0 | 0 | 0 |
| 30.05.2018 11:00 - 12:00 | 0 | 0 | 0 | 0 |
| 30.05.2018 12:00 - 13:00 | 0 | 0 | 0 | 0 |
| 30.05.2018 13:00 - 14:00 | 0 | 0 | 0 | 0 |
| 30.05.2018 14:00 - 15:00 | 0 | 0 | 0 | 0 |
| 30.05.2018 15:00 - 16:00 | 0 | 0 | 0 | 0 |
| 30.05.2018 16:00 - 17:00 | 0 | 0 | 0 | 0 |
| 30.05.2018 17:00 - 18:00 | 0 | 0 | 0 | 0 |
| 30.05.2018 18:00 - 19:00 | 0 | 0 | 0 | 0 |
| 30.05.2018 19:00 - 20:00 | 0 | 0 | 0 | 0 |
| 30.05.2018 20:00 - 21:00 | 0 | 0 | 0 | 0 |
| 30.05.2018 21:00 - 22:00 | 0 | 0 | 0 | 0 |
| 30.05.2018 22:00 - 23:00 | 0 | 0 | 0 | 0 |
| 30.05.2018 23:00 - 24:00 | 0 | 0 | 0 | 0 |
| 31.05.2018 00:00 - 01:00 | 0 | 0 | 0 | 0 |
| 31.05.2018 01:00 - 02:00 | 0 | 0 | 0 | 0 |
| 31.05.2018 02:00 - 03:00 | 0 | -600 | 0 | 0 |
| 31.05.2018 03:00 - 04:00 | 0 | -600 | 0 | 0 |
| 31.05.2018 04:00 - 05:00 | 0 | -600 | 0 | 0 |
| 31.05.2018 05:00 - 06:00 | 0 | -600 | 0 | 0 |
| 31.05.2018 06:00 - 07:00 | 0 | 0 | 0 | 0 |
| 31.05.2018 07:00 - 08:00 | 0 | 0 | 0 | 0 |
| 31.05.2018 08:00 - 09:00 | 0 | 0 | 0 | 0 |
| 31.05.2018 09:00 - 10:00 | 0 | 0 | 0 | 0 |
| 31.05.2018 10:00 - 11:00 | 0 | 0 | 0 | 0 |
| 31.05.2018 11:00 - 12:00 | 0 | 0 | 0 | 0 |
| 31.05.2018 12:00 - 13:00 | 0 | 0 | 0 | 0 |
| 31.05.2018 13:00 - 14:00 | 0 | 0 | 0 | 0 |
| 31.05.2018 14:00 - 15:00 | 0 | 0 | 0 | 0 |
| 31.05.2018 15:00 - 16:00 | 0 | 0 | 0 | 0 |
| 31.05.2018 16:00 - 17:00 | 0 | 0 | 0 | 0 |
| 31.05.2018 17:00 - 18:00 | 0 | 0 | 0 | 0 |
| 31.05.2018 18:00 - 19:00 | 0 | 0 | 0 | 0 |
| 31.05.2018 19:00 - 20:00 | 0 | 0 | 0 | 0 |
| 31.05.2018 20:00 - 21:00 | 0 | 0 | 0 | 0 |
| 31.05.2018 21:00 - 22:00 | 0 | 0 | 0 | 0 |
| 31.05.2018 22:00 - 23:00 | 0 | 0 | 0 | 0 |
| 31.05.2018 23:00 - 24:00 | 0 | 0 | 0 | 0 |
| 01.06.2018 00:00 - 01:00 | 0 | 0 | 0 | 0 |
| 01.06.2018 01:00 - 02:00 | 0 | 0 | 0 | 0 |
| 01.06.2018 02:00 - 03:00 | 0 | -730 | 0 | 0 |
| 01.06.2018 03:00 - 04:00 | 0 | -730 | 0 | 0 |
| 01.06.2018 04:00 - 05:00 | 0 | -730 | 0 | 0 |
| 01.06.2018 05:00 - 06:00 | 0 | -730 | 0 | 0 |